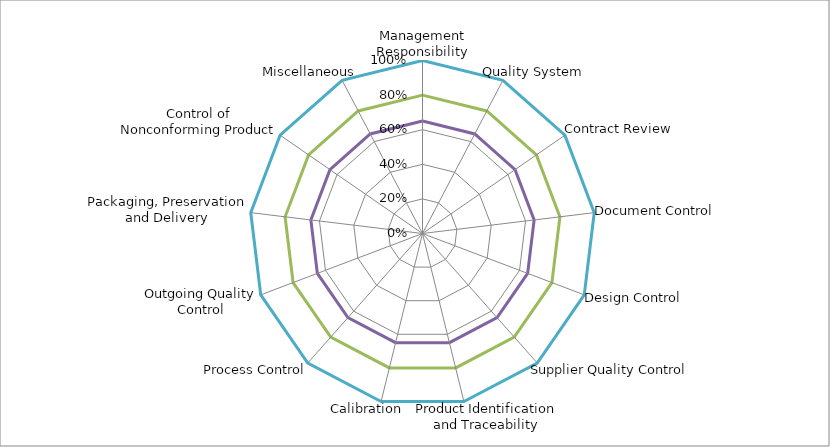
| Category | Series 0 | Series 1 | Series 2 | Series 3 | Series 4 |
|---|---|---|---|---|---|
| Management Responsibility | 0 | 0 | 0.8 | 0.65 | 1 |
| Quality System | 0 | 0 | 0.8 | 0.65 | 1 |
| Contract Review | 0 | 0 | 0.8 | 0.65 | 1 |
| Document Control | 0 | 0 | 0.8 | 0.65 | 1 |
| Design Control | 0 | 0 | 0.8 | 0.65 | 1 |
| Supplier Quality Control | 0 | 0 | 0.8 | 0.65 | 1 |
| Product Identification and Traceability | 0 | 0 | 0.8 | 0.65 | 1 |
| Calibration | 0 | 0 | 0.8 | 0.65 | 1 |
| Process Control | 0 | 0 | 0.8 | 0.65 | 1 |
| Outgoing Quality Control | 0 | 0 | 0.8 | 0.65 | 1 |
| Packaging, Preservation and Delivery | 0 | 0 | 0.8 | 0.65 | 1 |
| Control of Nonconforming Product | 0 | 0 | 0.8 | 0.65 | 1 |
| Miscellaneous | 0 | 0 | 0.8 | 0.65 | 1 |